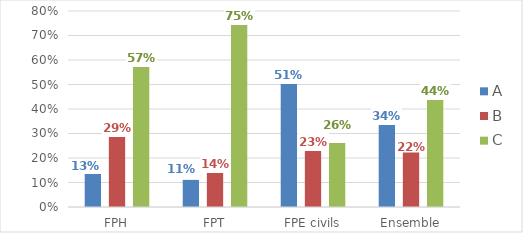
| Category | A | B | C |
|---|---|---|---|
| FPH | 0.135 | 0.291 | 0.575 |
| FPT | 0.111 | 0.141 | 0.748 |
| FPE civils | 0.506 | 0.232 | 0.261 |
| Ensemble | 0.338 | 0.223 | 0.439 |